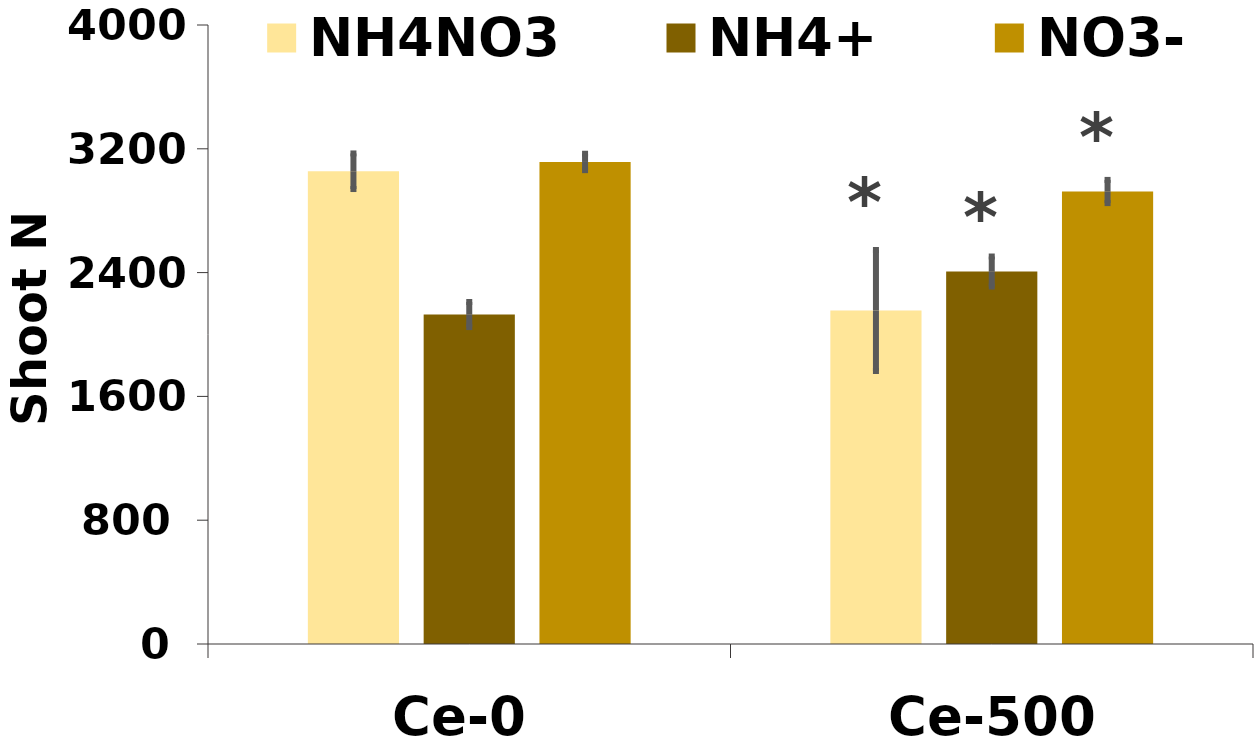
| Category | NH4NO3 | NH4+ | NO3- |
|---|---|---|---|
| Ce-0 | 3055 | 2129 | 3115 |
| Ce-500 | 2155 | 2407 | 2924 |